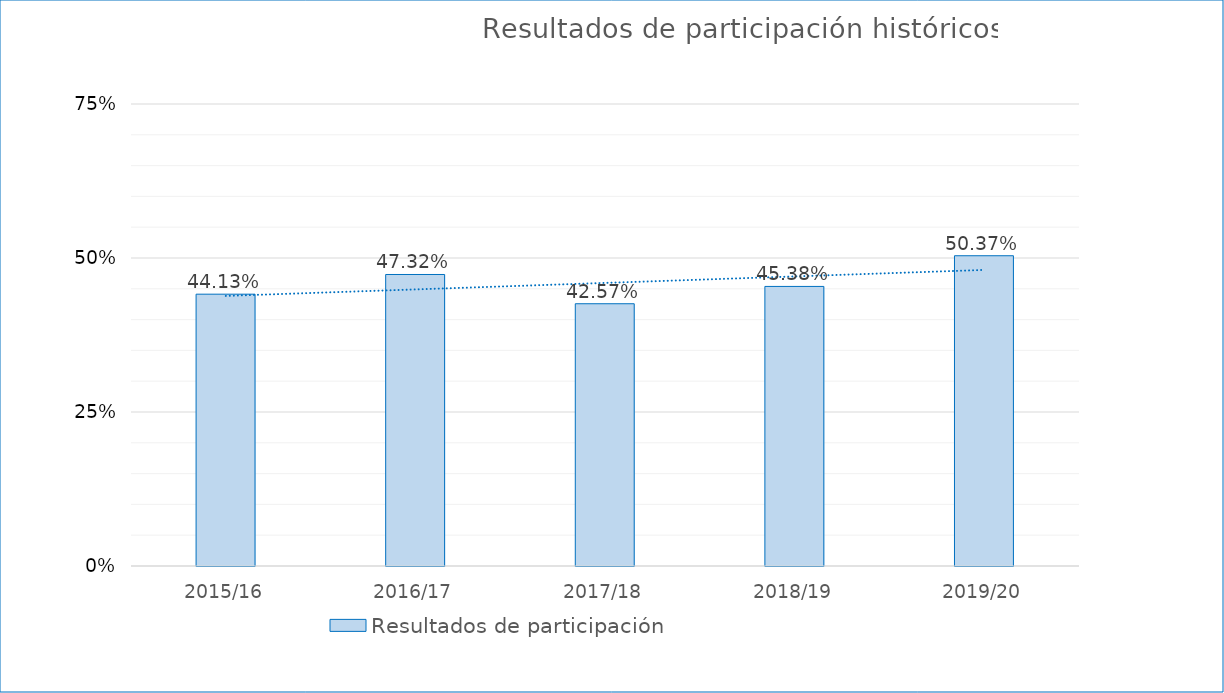
| Category | Resultados de participación |
|---|---|
| 2015/16 | 0.441 |
| 2016/17 | 0.473 |
| 2017/18 | 0.426 |
| 2018/19 | 0.454 |
| 2019/20 | 0.504 |